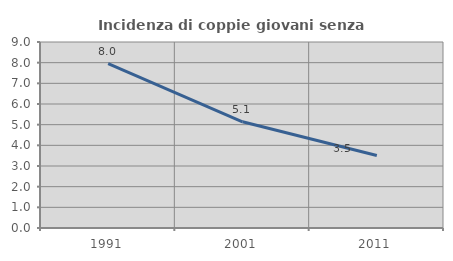
| Category | Incidenza di coppie giovani senza figli |
|---|---|
| 1991.0 | 7.958 |
| 2001.0 | 5.141 |
| 2011.0 | 3.51 |